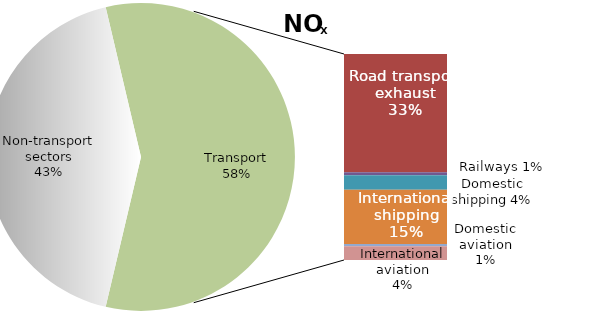
| Category | Series 0 |
|---|---|
| Non-transport sectors | 5528.009 |
| Road transport exhaust | 4268.284 |
| Road transport non-exhaust | 0 |
| Railways | 113.311 |
| Domestic shipping | 518.255 |
| International shipping | 1959.818 |
| Domestic aviation | 87.383 |
| International aviation | 493.87 |